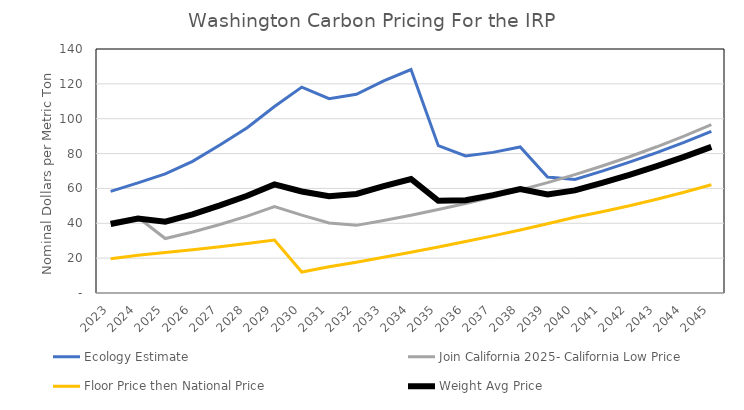
| Category | Ecology Estimate | Join California 2025- California Low Price | Floor Price then National Price | Weight Avg Price |
|---|---|---|---|---|
| 2023.0 | 58.31 | 40.74 | 19.7 | 39.583 |
| 2024.0 | 63.152 | 43.344 | 21.67 | 42.721 |
| 2025.0 | 68.386 | 31.24 | 23.187 | 40.937 |
| 2026.0 | 75.527 | 35.011 | 24.81 | 45.115 |
| 2027.0 | 84.884 | 39.289 | 26.547 | 50.239 |
| 2028.0 | 94.791 | 44.14 | 28.405 | 55.778 |
| 2029.0 | 106.967 | 49.639 | 30.393 | 62.333 |
| 2030.0 | 118.124 | 44.676 | 12 | 58.266 |
| 2031.0 | 111.496 | 40.208 | 15.031 | 55.578 |
| 2032.0 | 114.023 | 38.808 | 17.692 | 56.841 |
| 2033.0 | 121.702 | 41.619 | 20.469 | 61.263 |
| 2034.0 | 128.224 | 44.637 | 23.362 | 65.407 |
| 2035.0 | 84.555 | 47.874 | 26.379 | 52.936 |
| 2036.0 | 78.667 | 51.345 | 29.519 | 53.177 |
| 2037.0 | 80.686 | 55.065 | 32.789 | 56.18 |
| 2038.0 | 83.766 | 59.056 | 36.194 | 59.671 |
| 2039.0 | 66.5 | 63.343 | 39.737 | 56.526 |
| 2040.0 | 65.179 | 67.948 | 43.427 | 58.851 |
| 2041.0 | 69.952 | 72.889 | 46.632 | 63.157 |
| 2042.0 | 75.057 | 78.194 | 50.084 | 67.778 |
| 2043.0 | 80.539 | 83.895 | 53.798 | 72.743 |
| 2044.0 | 86.435 | 90.015 | 57.788 | 78.079 |
| 2045.0 | 92.747 | 96.592 | 62.076 | 83.804 |